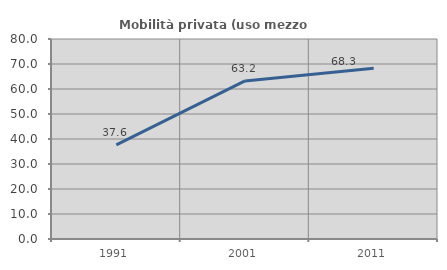
| Category | Mobilità privata (uso mezzo privato) |
|---|---|
| 1991.0 | 37.618 |
| 2001.0 | 63.231 |
| 2011.0 | 68.281 |